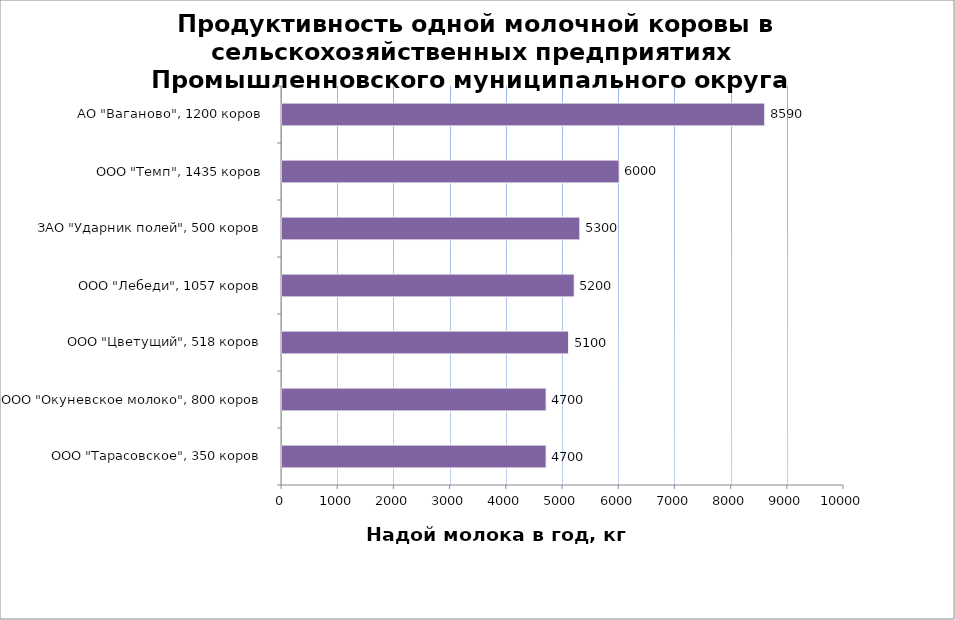
| Category | Series 0 |
|---|---|
| ООО "Тарасовское", 350 коров | 4700 |
| ООО "Окуневское молоко", 800 коров | 4700 |
| ООО "Цветущий", 518 коров | 5100 |
| ООО "Лебеди", 1057 коров | 5200 |
| ЗАО "Ударник полей", 500 коров | 5300 |
| ООО "Темп", 1435 коров | 6000 |
| АО "Ваганово", 1200 коров | 8590 |